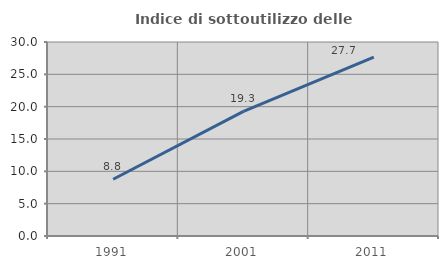
| Category | Indice di sottoutilizzo delle abitazioni  |
|---|---|
| 1991.0 | 8.777 |
| 2001.0 | 19.26 |
| 2011.0 | 27.655 |